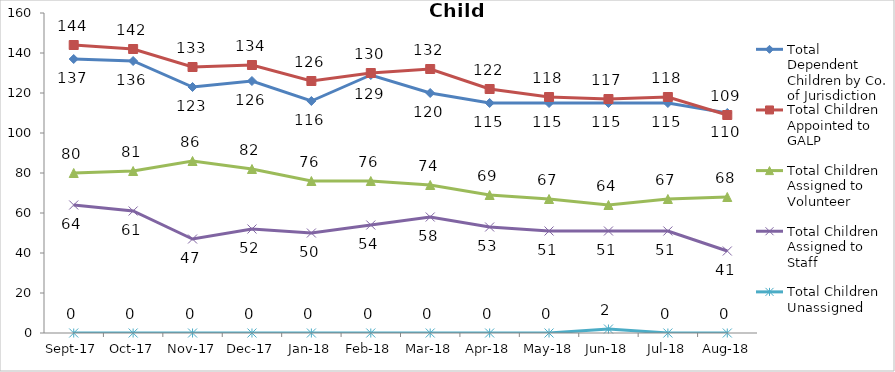
| Category | Total Dependent Children by Co. of Jurisdiction | Total Children Appointed to GALP | Total Children Assigned to Volunteer | Total Children Assigned to Staff | Total Children Unassigned |
|---|---|---|---|---|---|
| 2017-09-01 | 137 | 144 | 80 | 64 | 0 |
| 2017-10-01 | 136 | 142 | 81 | 61 | 0 |
| 2017-11-01 | 123 | 133 | 86 | 47 | 0 |
| 2017-12-01 | 126 | 134 | 82 | 52 | 0 |
| 2018-01-01 | 116 | 126 | 76 | 50 | 0 |
| 2018-02-01 | 129 | 130 | 76 | 54 | 0 |
| 2018-03-01 | 120 | 132 | 74 | 58 | 0 |
| 2018-04-01 | 115 | 122 | 69 | 53 | 0 |
| 2018-05-01 | 115 | 118 | 67 | 51 | 0 |
| 2018-06-01 | 115 | 117 | 64 | 51 | 2 |
| 2018-07-01 | 115 | 118 | 67 | 51 | 0 |
| 2018-08-01 | 110 | 109 | 68 | 41 | 0 |